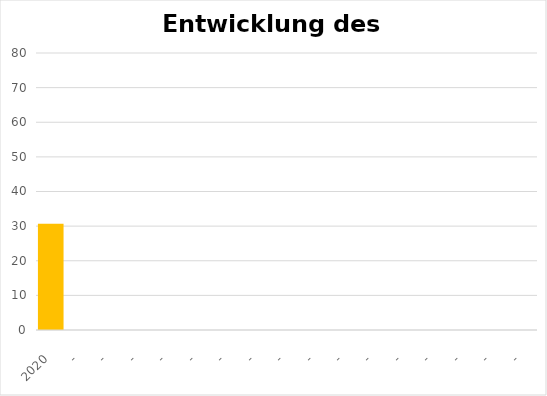
| Category | Series 0 |
|---|---|
| 2020 | 30.666 |
| - | 0 |
| - | 0 |
| - | 0 |
| - | 0 |
| - | 0 |
| - | 0 |
| - | 0 |
| - | 0 |
| - | 0 |
| - | 0 |
| - | 0 |
| - | 0 |
| - | 0 |
| - | 0 |
| - | 0 |
| - | 0 |